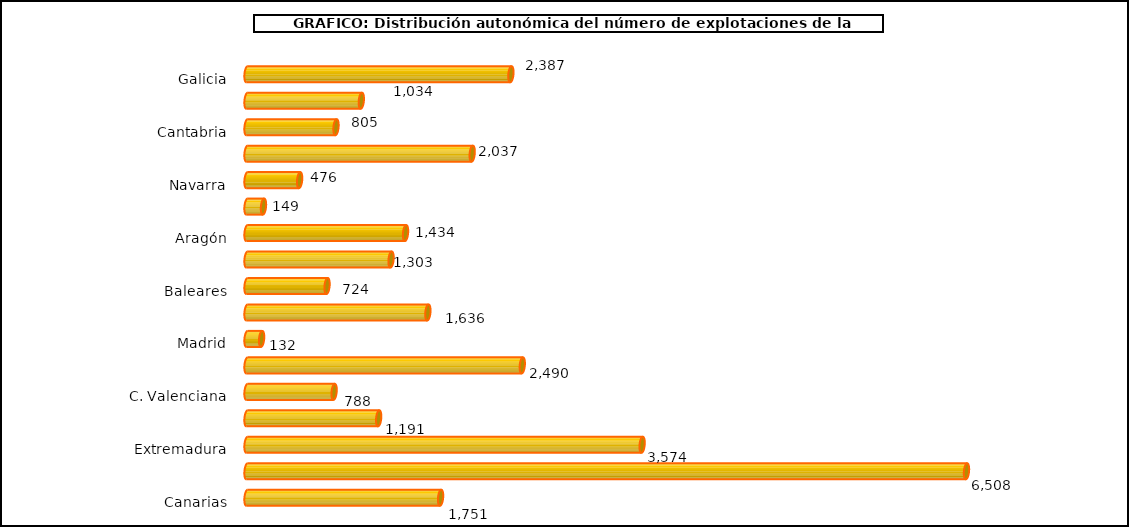
| Category | num. Explotaciones |
|---|---|
|   Galicia | 2387 |
|   P. de Asturias | 1034 |
|   Cantabria | 805 |
|   País Vasco | 2037 |
|   Navarra | 476 |
|   La Rioja | 149 |
|   Aragón | 1434 |
|   Cataluña | 1303 |
|   Baleares | 724 |
|   Castilla y León | 1636 |
|   Madrid | 132 |
|   Castilla – La Mancha | 2490 |
|   C. Valenciana | 788 |
|   R. de Murcia | 1191 |
|   Extremadura | 3574 |
|   Andalucía | 6508 |
|   Canarias | 1751 |